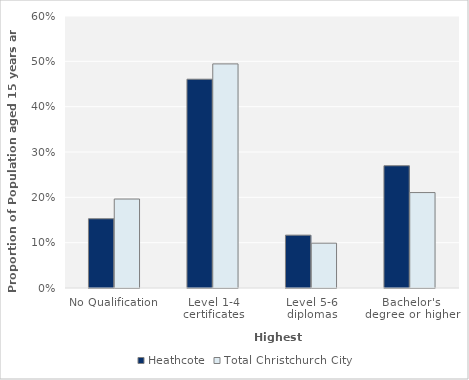
| Category | Heathcote | Total Christchurch City |
|---|---|---|
| No Qualification | 0.153 | 0.196 |
| Level 1-4 certificates | 0.461 | 0.494 |
| Level 5-6 diplomas | 0.117 | 0.099 |
| Bachelor's degree or higher | 0.27 | 0.211 |